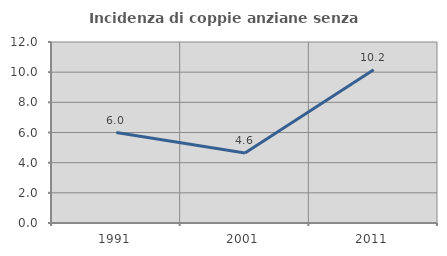
| Category | Incidenza di coppie anziane senza figli  |
|---|---|
| 1991.0 | 5.998 |
| 2001.0 | 4.644 |
| 2011.0 | 10.166 |